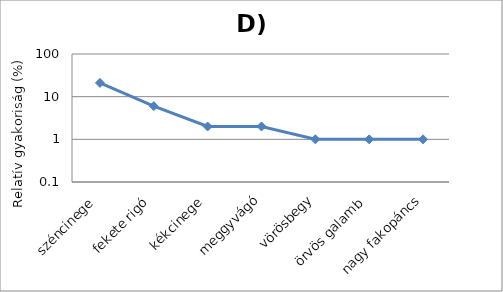
| Category | Series 0 |
|---|---|
| széncinege | 21 |
| fekete rigó | 6 |
| kékcinege | 2 |
| meggyvágó | 2 |
| vörösbegy | 1 |
| örvös galamb | 1 |
| nagy fakopáncs | 1 |